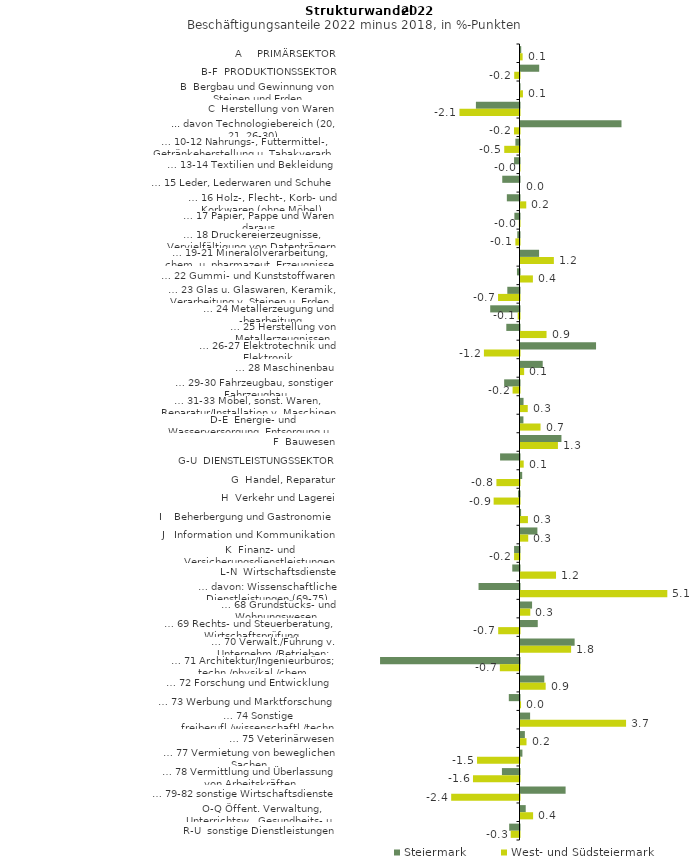
| Category | Steiermark | West- und Südsteiermark |
|---|---|---|
| A     PRIMÄRSEKTOR | 0.025 | 0.074 |
| B-F  PRODUKTIONSSEKTOR | 0.65 | -0.184 |
| B  Bergbau und Gewinnung von Steinen und Erden | -0.011 | 0.085 |
| C  Herstellung von Waren | -1.516 | -2.088 |
| ... davon Technologiebereich (20, 21, 26-30) | 3.513 | -0.191 |
| … 10-12 Nahrungs-, Futtermittel-, Getränkeherstellung u. Tabakverarb. | -0.143 | -0.531 |
| … 13-14 Textilien und Bekleidung | -0.189 | -0.008 |
| … 15 Leder, Lederwaren und Schuhe | -0.6 | 0 |
| … 16 Holz-, Flecht-, Korb- und Korkwaren (ohne Möbel)  | -0.44 | 0.2 |
| … 17 Papier, Pappe und Waren daraus  | -0.178 | -0.023 |
| … 18 Druckereierzeugnisse, Vervielfältigung von Datenträgern | -0.077 | -0.144 |
| … 19-21 Mineralölverarbeitung, chem. u. pharmazeut. Erzeugnisse | 0.646 | 1.161 |
| … 22 Gummi- und Kunststoffwaren | -0.089 | 0.431 |
| … 23 Glas u. Glaswaren, Keramik, Verarbeitung v. Steinen u. Erden  | -0.424 | -0.746 |
| … 24 Metallerzeugung und -bearbeitung | -1.019 | -0.063 |
| … 25 Herstellung von Metallerzeugnissen  | -0.459 | 0.906 |
| … 26-27 Elektrotechnik und Elektronik | 2.628 | -1.238 |
| … 28 Maschinenbau | 0.773 | 0.127 |
| … 29-30 Fahrzeugbau, sonstiger Fahrzeugbau | -0.534 | -0.241 |
| … 31-33 Möbel, sonst. Waren, Reparatur/Installation v. Maschinen | 0.106 | 0.252 |
| D-E  Energie- und Wasserversorgung, Entsorgung u. Rückgewinnung | 0.102 | 0.697 |
| F  Bauwesen | 1.424 | 1.302 |
| G-U  DIENSTLEISTUNGSSEKTOR | -0.676 | 0.112 |
| G  Handel, Reparatur | 0.059 | -0.803 |
| H  Verkehr und Lagerei | -0.05 | -0.9 |
| I    Beherbergung und Gastronomie | 0.02 | 0.259 |
| J   Information und Kommunikation | 0.588 | 0.269 |
| K  Finanz- und Versicherungsdienstleistungen | -0.188 | -0.189 |
| L-N  Wirtschaftsdienste | -0.252 | 1.236 |
| … davon: Wissenschaftliche Dienstleistungen (69-75) | -1.425 | 5.107 |
| … 68 Grundstücks- und Wohnungswesen  | 0.402 | 0.34 |
| … 69 Rechts- und Steuerberatung, Wirtschaftsprüfung | 0.6 | -0.742 |
| … 70 Verwalt./Führung v. Unternehm./Betrieben; Unternehmensberat. | 1.883 | 1.76 |
| … 71 Architektur/Ingenieurbüros; techn./physikal./chem. Untersuchung | -4.85 | -0.684 |
| … 72 Forschung und Entwicklung  | 0.828 | 0.876 |
| … 73 Werbung und Marktforschung | -0.372 | 0.019 |
| … 74 Sonstige freiberufl./wissenschaftl./techn. Tätigkeiten | 0.334 | 3.672 |
| … 75 Veterinärwesen | 0.152 | 0.209 |
| … 77 Vermietung von beweglichen Sachen  | 0.067 | -1.477 |
| … 78 Vermittlung und Überlassung von Arbeitskräften | -0.611 | -1.618 |
| … 79-82 sonstige Wirtschaftsdienste | 1.569 | -2.376 |
| O-Q Öffent. Verwaltung, Unterrichtsw., Gesundheits- u. Sozialwesen | 0.182 | 0.438 |
| R-U  sonstige Dienstleistungen | -0.359 | -0.306 |